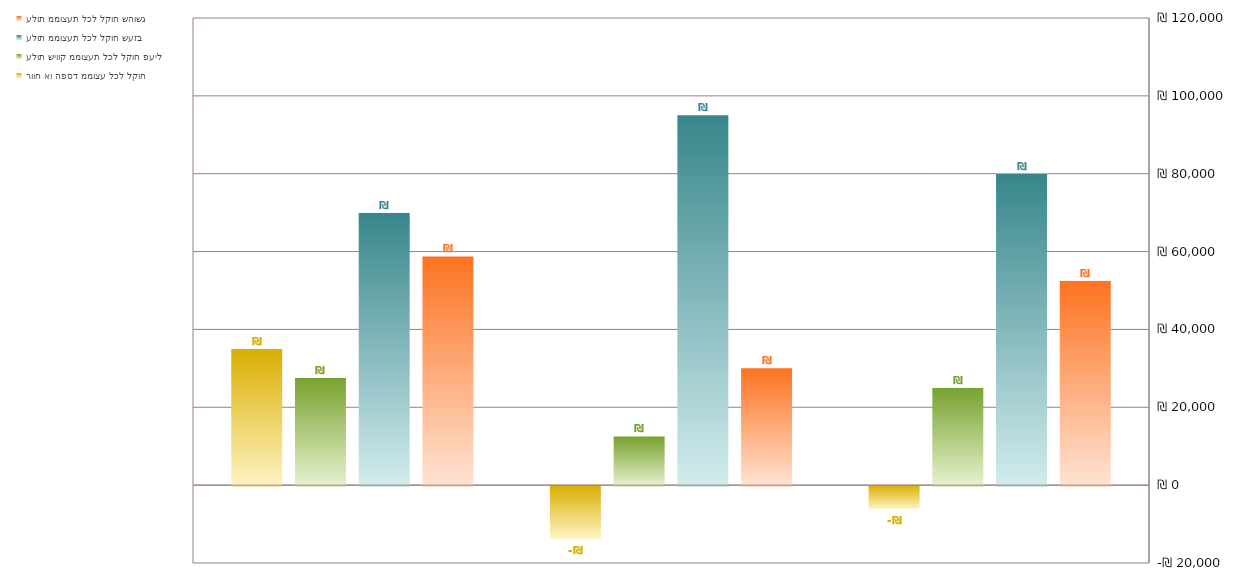
| Category | עלות ממוצעת לכל לקוח שהושג | עלות ממוצעת לכל לקוח שעזב | עלות שיווק ממוצעת לכל לקוח פעיל | רווח או הפסד ממוצע לכל לקוח |
|---|---|---|---|---|
|  | 52500 | 80000 | 25000 | -5833.333 |
|  | 30000 | 95000 | 12500 | -13500 |
|  | 58750 | 70000 | 27500 | 35000 |